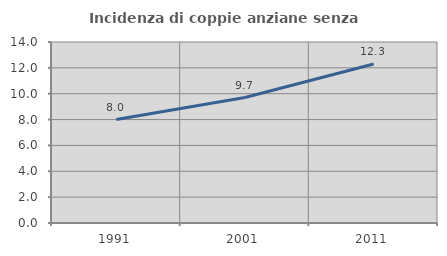
| Category | Incidenza di coppie anziane senza figli  |
|---|---|
| 1991.0 | 8.003 |
| 2001.0 | 9.706 |
| 2011.0 | 12.299 |